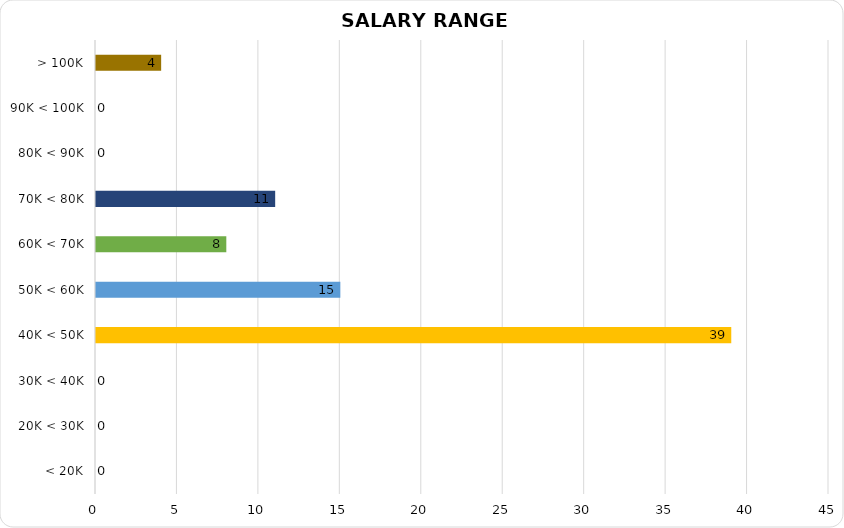
| Category | Series 0 |
|---|---|
| < 20K | 0 |
| 20K < 30K | 0 |
| 30K < 40K | 0 |
| 40K < 50K | 39 |
| 50K < 60K | 15 |
| 60K < 70K | 8 |
| 70K < 80K | 11 |
| 80K < 90K | 0 |
| 90K < 100K | 0 |
| > 100K | 4 |